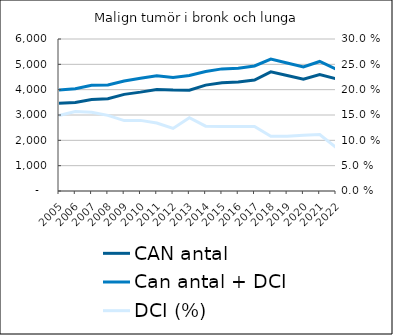
| Category |  CAN antal  |  Can antal + DCI  |
|---|---|---|
| 2005.0 | 3467 | 3984 |
| 2006.0 | 3490 | 4037 |
| 2007.0 | 3614 | 4176 |
| 2008.0 | 3639 | 4182 |
| 2009.0 | 3814 | 4344 |
| 2010.0 | 3903 | 4447 |
| 2011.0 | 4007 | 4545 |
| 2012.0 | 3986 | 4478 |
| 2013.0 | 3981 | 4557 |
| 2014.0 | 4180 | 4715 |
| 2015.0 | 4276 | 4820 |
| 2016.0 | 4303 | 4850 |
| 2017.0 | 4379 | 4937 |
| 2018.0 | 4701 | 5208 |
| 2019.0 | 4561 | 5054 |
| 2020.0 | 4410 | 4896 |
| 2021.0 | 4600 | 5113 |
| 2022.0 | 4433 | 4814 |